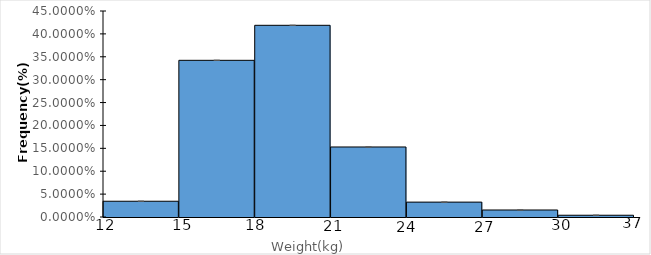
| Category | Series 0 |
|---|---|
| [12;15[ | 0.034 |
| [15;18[ | 0.342 |
| [18;21[ | 0.419 |
| [21;24[ | 0.153 |
| [24;27[ | 0.033 |
| [27;30[ | 0.015 |
| [30;33] | 0.004 |